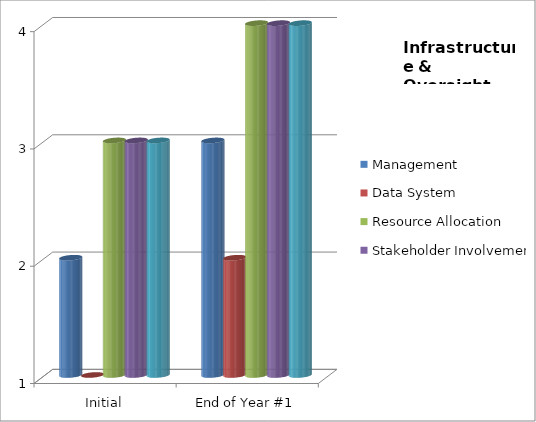
| Category | Management  | Data System  | Resource Allocation  | Stakeholder Involvement  | Policy & Guidance  |
|---|---|---|---|---|---|
| Initial | 2 | 1 | 3 | 3 | 3 |
| End of Year #1 | 3 | 2 | 4 | 4 | 4 |